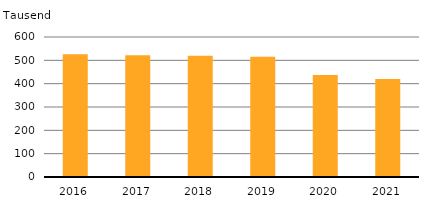
| Category | Anzahl |
|---|---|
| 2016.0 | 525582 |
| 2017.0 | 521968 |
| 2018.0 | 519409 |
| 2019.0 | 515039 |
| 2020.0 | 436724 |
| 2021.0 | 419995 |